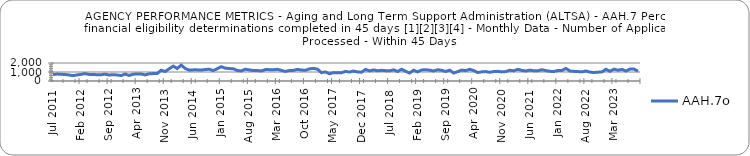
| Category | AAH.7o |
|---|---|
| 2011-07-01 | 706 |
| 2011-08-01 | 771 |
| 2011-09-01 | 746 |
| 2011-10-01 | 725 |
| 2011-11-01 | 671 |
| 2011-12-01 | 593 |
| 2012-01-01 | 676 |
| 2012-02-01 | 739 |
| 2012-03-01 | 824 |
| 2012-04-01 | 731 |
| 2012-05-01 | 729 |
| 2012-06-01 | 695 |
| 2012-07-01 | 696 |
| 2012-08-01 | 763 |
| 2012-09-01 | 665 |
| 2012-10-01 | 706 |
| 2012-11-01 | 671 |
| 2012-12-01 | 601 |
| 2013-01-01 | 773 |
| 2013-02-01 | 621 |
| 2013-03-01 | 754 |
| 2013-04-01 | 788 |
| 2013-05-01 | 779 |
| 2013-06-01 | 676 |
| 2013-07-01 | 801 |
| 2013-08-01 | 822 |
| 2013-09-01 | 827 |
| 2013-10-01 | 1204 |
| 2013-11-01 | 1056 |
| 2013-12-01 | 1360 |
| 2014-01-01 | 1658 |
| 2014-02-01 | 1385 |
| 2014-03-01 | 1770 |
| 2014-04-01 | 1392 |
| 2014-05-01 | 1205 |
| 2014-06-01 | 1238 |
| 2014-07-01 | 1236 |
| 2014-08-01 | 1214 |
| 2014-09-01 | 1275 |
| 2014-10-01 | 1312 |
| 2014-11-01 | 1156 |
| 2014-12-01 | 1372 |
| 2015-01-01 | 1592 |
| 2015-02-01 | 1426 |
| 2015-03-01 | 1385 |
| 2015-04-01 | 1355 |
| 2015-05-01 | 1171 |
| 2015-06-01 | 1114 |
| 2015-07-01 | 1312 |
| 2015-08-01 | 1229 |
| 2015-09-01 | 1164 |
| 2015-10-01 | 1160 |
| 2015-11-01 | 1119 |
| 2015-12-01 | 1272 |
| 2016-01-01 | 1263 |
| 2016-02-01 | 1253 |
| 2016-03-01 | 1298 |
| 2016-04-01 | 1175 |
| 2016-05-01 | 1062 |
| 2016-06-01 | 1167 |
| 2016-07-01 | 1175 |
| 2016-08-01 | 1294 |
| 2016-09-01 | 1216 |
| 2016-10-01 | 1191 |
| 2016-11-01 | 1343 |
| 2016-12-01 | 1399 |
| 2017-01-01 | 1312 |
| 2017-02-01 | 926 |
| 2017-03-01 | 1011 |
| 2017-04-01 | 795 |
| 2017-05-01 | 932 |
| 2017-06-01 | 918 |
| 2017-07-01 | 922 |
| 2017-08-01 | 1073 |
| 2017-09-01 | 996 |
| 2017-10-01 | 1103 |
| 2017-11-01 | 1010 |
| 2017-12-01 | 976 |
| 2018-01-01 | 1289 |
| 2018-02-01 | 1123 |
| 2018-03-01 | 1229 |
| 2018-04-01 | 1141 |
| 2018-05-01 | 1188 |
| 2018-06-01 | 1150 |
| 2018-07-01 | 1136 |
| 2018-08-01 | 1239 |
| 2018-09-01 | 1051 |
| 2018-10-01 | 1308 |
| 2018-11-01 | 1087 |
| 2018-12-01 | 882 |
| 2019-01-01 | 1202 |
| 2019-02-01 | 1011 |
| 2019-03-01 | 1227 |
| 2019-04-01 | 1259 |
| 2019-05-01 | 1202 |
| 2019-06-01 | 1114 |
| 2019-07-01 | 1250 |
| 2019-08-01 | 1186 |
| 2019-09-01 | 1060 |
| 2019-10-01 | 1208 |
| 2019-11-01 | 886 |
| 2019-12-01 | 1041 |
| 2020-01-01 | 1212 |
| 2020-02-01 | 1152 |
| 2020-03-01 | 1298 |
| 2020-04-01 | 1157 |
| 2020-05-01 | 942 |
| 2020-06-01 | 1017 |
| 2020-07-01 | 1050 |
| 2020-08-01 | 968 |
| 2020-09-01 | 1042 |
| 2020-10-01 | 1076 |
| 2020-11-01 | 1012 |
| 2020-12-01 | 1048 |
| 2021-01-01 | 1196 |
| 2021-02-01 | 1138 |
| 2021-03-01 | 1297 |
| 2021-04-01 | 1179 |
| 2021-05-01 | 1116 |
| 2021-06-01 | 1205 |
| 2021-07-01 | 1138 |
| 2021-08-01 | 1136 |
| 2021-09-01 | 1255 |
| 2021-10-01 | 1159 |
| 2021-11-01 | 1075 |
| 2021-12-01 | 1050 |
| 2022-01-01 | 1173 |
| 2022-02-01 | 1155 |
| 2022-03-01 | 1404 |
| 2022-04-01 | 1111 |
| 2022-05-01 | 1069 |
| 2022-06-01 | 1051 |
| 2022-07-01 | 1014 |
| 2022-08-01 | 1110 |
| 2022-09-01 | 992 |
| 2022-10-01 | 941 |
| 2022-11-01 | 982 |
| 2022-12-01 | 1011 |
| 2023-01-01 | 1299 |
| 2023-02-01 | 1076 |
| 2023-03-01 | 1318 |
| 2023-04-01 | 1197 |
| 2023-05-01 | 1286 |
| 2023-06-01 | 1108 |
| 2023-07-01 | 1329 |
| 2023-08-01 | 1329 |
| 2023-09-01 | 1087 |